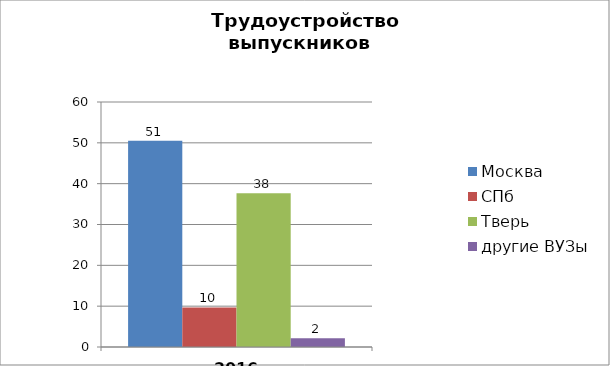
| Category | Москва | СПб | Тверь | другие ВУЗы |
|---|---|---|---|---|
| 2016 г.(%) | 50.538 | 9.677 | 37.634 | 2.151 |